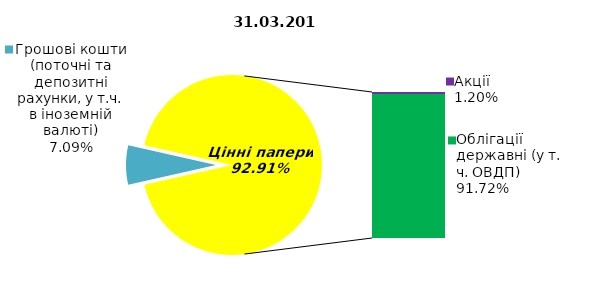
| Category | Series 0 |
|---|---|
| Грошові кошти (поточні та депозитні рахунки, у т.ч. в іноземній валюті) | 7.553 |
| Банківські метали | 0 |
| Нерухомість | 0 |
| Інші активи | 0 |
| Акції | 1.274 |
| Облігації підприємств | 0 |
| Муніципальні облігації | 0 |
| Облігації державні (у т. ч. ОВДП) | 97.727 |
| Іпотечні сертифікати | 0 |